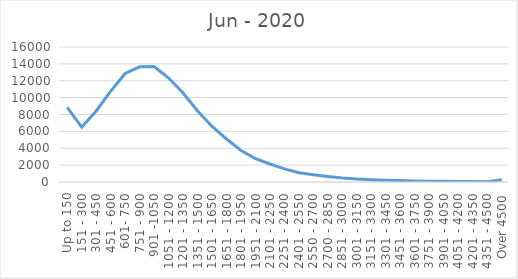
| Category | Jun - 2020 |
|---|---|
| Up to 150 | 8839 |
| 151 - 300 | 6510 |
| 301 - 450 | 8421 |
| 451 - 600 | 10767 |
| 601- 750 | 12867 |
| 751 - 900 | 13652 |
| 901 -1050 | 13684 |
| 1051 - 1200 | 12318 |
| 1201 - 1350 | 10555 |
| 1351 - 1500 | 8411 |
| 1501 - 1650 | 6588 |
| 1651 - 1800 | 5094 |
| 1801 - 1950 | 3732 |
| 1951 - 2100 | 2777 |
| 2101 - 2250 | 2134 |
| 2251 - 2400 | 1554 |
| 2401 - 2550 | 1107 |
| 2550 - 2700 | 852 |
| 2700 - 2850 | 654 |
| 2851 - 3000 | 468 |
| 3001 - 3150 | 348 |
| 3151 - 3300 | 276 |
| 3301 - 3450 | 209 |
| 3451 - 3600 | 168 |
| 3601 - 3750 | 122 |
| 3751 - 3900 | 96 |
| 3901 - 4050 | 76 |
| 4051 - 4200 | 69 |
| 4201 - 4350 | 54 |
| 4351 - 4500 | 43 |
| Over 4500 | 275 |